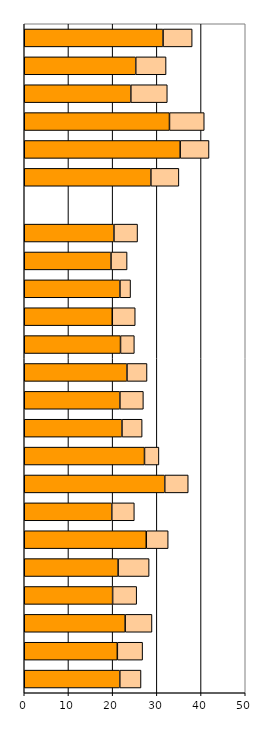
| Category | Series 0 | Series 1 |
|---|---|---|
| 0 | 21.614 | 4.803 |
| 1 | 21.06 | 5.716 |
| 2 | 22.826 | 6.071 |
| 3 | 19.994 | 5.442 |
| 4 | 21.234 | 7.017 |
| 5 | 27.607 | 4.955 |
| 6 | 19.802 | 5.102 |
| 7 | 31.786 | 5.313 |
| 8 | 27.203 | 3.264 |
| 9 | 22.106 | 4.564 |
| 10 | 21.635 | 5.316 |
| 11 | 23.238 | 4.534 |
| 12 | 21.777 | 3.13 |
| 13 | 19.914 | 5.195 |
| 14 | 21.647 | 2.405 |
| 15 | 19.624 | 3.643 |
| 16 | 20.29 | 5.345 |
| 17 | 0 | 0 |
| 18 | 28.647 | 6.34 |
| 19 | 35.273 | 6.526 |
| 20 | 32.858 | 7.863 |
| 21 | 24.111 | 8.249 |
| 22 | 25.224 | 6.86 |
| 23 | 31.405 | 6.584 |